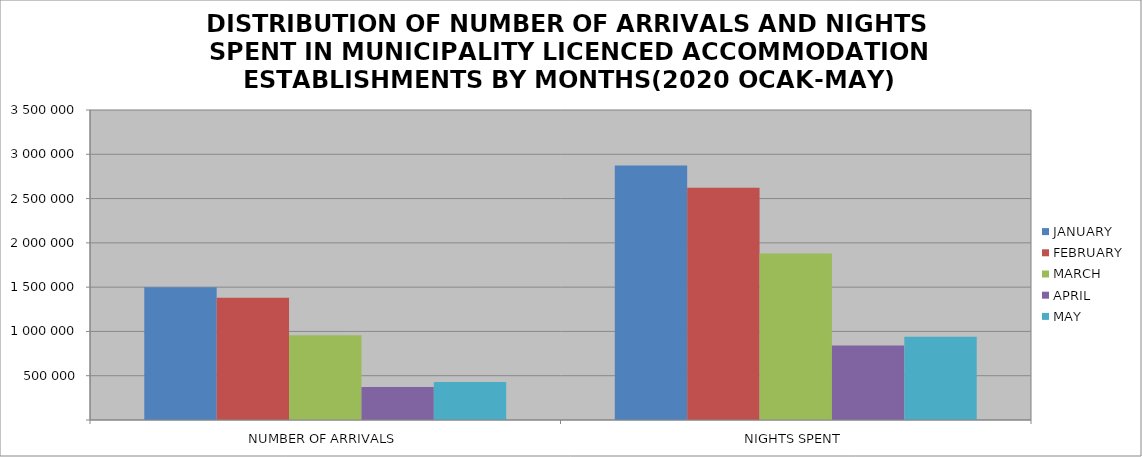
| Category | JANUARY | FEBRUARY | MARCH | APRIL | MAY |
|---|---|---|---|---|---|
| NUMBER OF ARRIVALS | 1497815 | 1380765 | 955554 | 372466 | 430328 |
| NIGHTS SPENT | 2872303 | 2621819 | 1878971 | 839735 | 939652 |